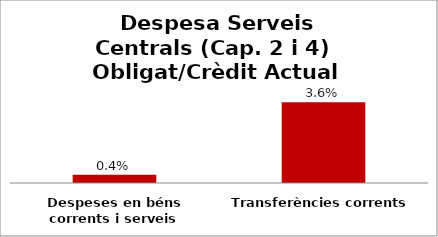
| Category | Series 0 |
|---|---|
| Despeses en béns corrents i serveis | 0.004 |
| Transferències corrents | 0.036 |